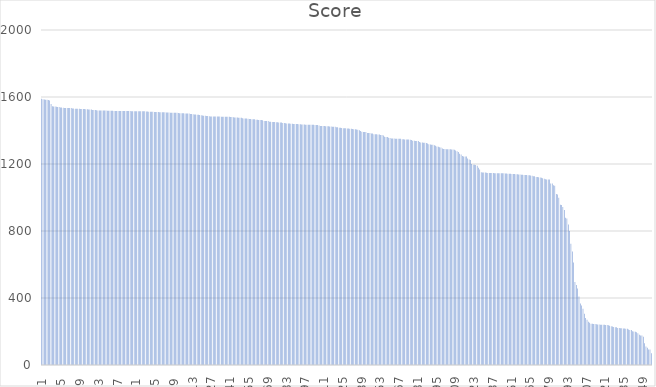
| Category | Series1 |
|---|---|
| 0 | 1589.4 |
| 1 | 1586 |
| 2 | 1585.5 |
| 3 | 1584.2 |
| 4 | 1584.2 |
| 5 | 1581.9 |
| 6 | 1579.1 |
| 7 | 1558.5 |
| 8 | 1544.2 |
| 9 | 1543.4 |
| 10 | 1542.6 |
| 11 | 1541.1 |
| 12 | 1540.6 |
| 13 | 1540.6 |
| 14 | 1537.3 |
| 15 | 1536.7 |
| 16 | 1535.6 |
| 17 | 1534.1 |
| 18 | 1534 |
| 19 | 1534 |
| 20 | 1534 |
| 21 | 1534 |
| 22 | 1533.8 |
| 23 | 1531.6 |
| 24 | 1531.3 |
| 25 | 1530.3 |
| 26 | 1530.3 |
| 27 | 1530.1 |
| 28 | 1529.8 |
| 29 | 1529 |
| 30 | 1529 |
| 31 | 1528.4 |
| 32 | 1527.9 |
| 33 | 1526.9 |
| 34 | 1526.2 |
| 35 | 1526 |
| 36 | 1525.9 |
| 37 | 1524.8 |
| 38 | 1522.8 |
| 39 | 1522.8 |
| 40 | 1522.8 |
| 41 | 1521.3 |
| 42 | 1518.9 |
| 43 | 1518.9 |
| 44 | 1518.9 |
| 45 | 1518.9 |
| 46 | 1518.9 |
| 47 | 1518.9 |
| 48 | 1518.9 |
| 49 | 1517.4 |
| 50 | 1517.4 |
| 51 | 1517.4 |
| 52 | 1517.4 |
| 53 | 1517.3 |
| 54 | 1517.1 |
| 55 | 1517 |
| 56 | 1517 |
| 57 | 1516.9 |
| 58 | 1516.9 |
| 59 | 1516.9 |
| 60 | 1516.9 |
| 61 | 1516.9 |
| 62 | 1516.1 |
| 63 | 1516.1 |
| 64 | 1516.1 |
| 65 | 1516.1 |
| 66 | 1516.1 |
| 67 | 1515.3 |
| 68 | 1515.3 |
| 69 | 1515.3 |
| 70 | 1515.2 |
| 71 | 1515 |
| 72 | 1514.8 |
| 73 | 1514.8 |
| 74 | 1514.7 |
| 75 | 1514.7 |
| 76 | 1514.7 |
| 77 | 1514.3 |
| 78 | 1513.1 |
| 79 | 1513 |
| 80 | 1512.6 |
| 81 | 1512.1 |
| 82 | 1511.7 |
| 83 | 1511.2 |
| 84 | 1511 |
| 85 | 1511 |
| 86 | 1510.8 |
| 87 | 1510.2 |
| 88 | 1509.2 |
| 89 | 1509.2 |
| 90 | 1509.2 |
| 91 | 1508.9 |
| 92 | 1508.3 |
| 93 | 1508.1 |
| 94 | 1508 |
| 95 | 1507.4 |
| 96 | 1506.7 |
| 97 | 1506.7 |
| 98 | 1505.6 |
| 99 | 1505.3 |
| 100 | 1505.3 |
| 101 | 1505.3 |
| 102 | 1505.2 |
| 103 | 1503.3 |
| 104 | 1503.3 |
| 105 | 1503.3 |
| 106 | 1503.3 |
| 107 | 1502.2 |
| 108 | 1502.2 |
| 109 | 1501.5 |
| 110 | 1501.2 |
| 111 | 1498.3 |
| 112 | 1497.9 |
| 113 | 1496.8 |
| 114 | 1495.3 |
| 115 | 1494.8 |
| 116 | 1493.8 |
| 117 | 1493.7 |
| 118 | 1491.8 |
| 119 | 1491.2 |
| 120 | 1489.8 |
| 121 | 1487.7 |
| 122 | 1487.5 |
| 123 | 1487.2 |
| 124 | 1486.6 |
| 125 | 1485.4 |
| 126 | 1484.2 |
| 127 | 1484.2 |
| 128 | 1484.2 |
| 129 | 1484.2 |
| 130 | 1483.9 |
| 131 | 1483.9 |
| 132 | 1483.5 |
| 133 | 1483.5 |
| 134 | 1482.8 |
| 135 | 1482.4 |
| 136 | 1482.4 |
| 137 | 1482.3 |
| 138 | 1482 |
| 139 | 1482 |
| 140 | 1481.7 |
| 141 | 1480.5 |
| 142 | 1480.5 |
| 143 | 1479.3 |
| 144 | 1478.3 |
| 145 | 1478.3 |
| 146 | 1477.7 |
| 147 | 1476.1 |
| 148 | 1476.1 |
| 149 | 1475.5 |
| 150 | 1473 |
| 151 | 1471.5 |
| 152 | 1471.3 |
| 153 | 1471.1 |
| 154 | 1469.6 |
| 155 | 1469.2 |
| 156 | 1468.4 |
| 157 | 1467.4 |
| 158 | 1467 |
| 159 | 1467 |
| 160 | 1463.5 |
| 161 | 1463.5 |
| 162 | 1463.1 |
| 163 | 1462.7 |
| 164 | 1462.5 |
| 165 | 1461.9 |
| 166 | 1456.8 |
| 167 | 1456 |
| 168 | 1456 |
| 169 | 1456 |
| 170 | 1452.4 |
| 171 | 1452.2 |
| 172 | 1451.3 |
| 173 | 1451.3 |
| 174 | 1450.4 |
| 175 | 1449.8 |
| 176 | 1448.9 |
| 177 | 1448.4 |
| 178 | 1447.5 |
| 179 | 1447.2 |
| 180 | 1444.9 |
| 181 | 1444.8 |
| 182 | 1442.6 |
| 183 | 1442.2 |
| 184 | 1441.9 |
| 185 | 1441.2 |
| 186 | 1440 |
| 187 | 1439.6 |
| 188 | 1439.5 |
| 189 | 1439.1 |
| 190 | 1438.9 |
| 191 | 1438.1 |
| 192 | 1437.6 |
| 193 | 1437.4 |
| 194 | 1435.8 |
| 195 | 1435.8 |
| 196 | 1435.1 |
| 197 | 1434.8 |
| 198 | 1434.7 |
| 199 | 1434.6 |
| 200 | 1434.4 |
| 201 | 1434.3 |
| 202 | 1433.9 |
| 203 | 1433.9 |
| 204 | 1433.5 |
| 205 | 1433.5 |
| 206 | 1432.8 |
| 207 | 1430.2 |
| 208 | 1426.9 |
| 209 | 1426.7 |
| 210 | 1426.7 |
| 211 | 1426.7 |
| 212 | 1426.1 |
| 213 | 1426.1 |
| 214 | 1425.8 |
| 215 | 1424.1 |
| 216 | 1424 |
| 217 | 1422.3 |
| 218 | 1422.1 |
| 219 | 1421.7 |
| 220 | 1419.6 |
| 221 | 1419.6 |
| 222 | 1416.4 |
| 223 | 1415.7 |
| 224 | 1415.5 |
| 225 | 1413.3 |
| 226 | 1412.8 |
| 227 | 1412.8 |
| 228 | 1412.6 |
| 229 | 1411.8 |
| 230 | 1411.1 |
| 231 | 1410.1 |
| 232 | 1408.9 |
| 233 | 1407.5 |
| 234 | 1407.4 |
| 235 | 1406.7 |
| 236 | 1404.1 |
| 237 | 1402.2 |
| 238 | 1396.5 |
| 239 | 1392.7 |
| 240 | 1391.5 |
| 241 | 1391 |
| 242 | 1390.5 |
| 243 | 1385.4 |
| 244 | 1385.1 |
| 245 | 1384.4 |
| 246 | 1382.6 |
| 247 | 1382.2 |
| 248 | 1378 |
| 249 | 1377 |
| 250 | 1377 |
| 251 | 1376.3 |
| 252 | 1375.4 |
| 253 | 1372.8 |
| 254 | 1372.8 |
| 255 | 1370.8 |
| 256 | 1362.7 |
| 257 | 1361.2 |
| 258 | 1361.2 |
| 259 | 1356.9 |
| 260 | 1354.7 |
| 261 | 1352.6 |
| 262 | 1352.3 |
| 263 | 1352.1 |
| 264 | 1351.1 |
| 265 | 1350.2 |
| 266 | 1350.1 |
| 267 | 1350.1 |
| 268 | 1350.1 |
| 269 | 1348.1 |
| 270 | 1347.3 |
| 271 | 1346.8 |
| 272 | 1345.9 |
| 273 | 1345.9 |
| 274 | 1345.9 |
| 275 | 1345.5 |
| 276 | 1343.7 |
| 277 | 1339.3 |
| 278 | 1339.3 |
| 279 | 1337.6 |
| 280 | 1337.6 |
| 281 | 1337 |
| 282 | 1330.8 |
| 283 | 1328.6 |
| 284 | 1327.8 |
| 285 | 1327.5 |
| 286 | 1326.6 |
| 287 | 1325 |
| 288 | 1321.8 |
| 289 | 1318.6 |
| 290 | 1316.8 |
| 291 | 1314.8 |
| 292 | 1314.3 |
| 293 | 1311.5 |
| 294 | 1308.8 |
| 295 | 1304 |
| 296 | 1303.3 |
| 297 | 1299.8 |
| 298 | 1299.2 |
| 299 | 1293.2 |
| 300 | 1289.9 |
| 301 | 1289.9 |
| 302 | 1287.5 |
| 303 | 1287.5 |
| 304 | 1287.5 |
| 305 | 1287.5 |
| 306 | 1287.3 |
| 307 | 1287.3 |
| 308 | 1285.1 |
| 309 | 1280.7 |
| 310 | 1276 |
| 311 | 1272 |
| 312 | 1261.2 |
| 313 | 1257.1 |
| 314 | 1248.3 |
| 315 | 1244.1 |
| 316 | 1244.1 |
| 317 | 1244.1 |
| 318 | 1232.4 |
| 319 | 1227.5 |
| 320 | 1224.3 |
| 321 | 1200.7 |
| 322 | 1196.2 |
| 323 | 1195.1 |
| 324 | 1193.3 |
| 325 | 1189 |
| 326 | 1177 |
| 327 | 1167 |
| 328 | 1151.4 |
| 329 | 1149.5 |
| 330 | 1149 |
| 331 | 1149 |
| 332 | 1148.4 |
| 333 | 1146.9 |
| 334 | 1146.9 |
| 335 | 1146.2 |
| 336 | 1146.2 |
| 337 | 1145.8 |
| 338 | 1145.5 |
| 339 | 1145.4 |
| 340 | 1145.3 |
| 341 | 1145.3 |
| 342 | 1145.3 |
| 343 | 1145 |
| 344 | 1144.7 |
| 345 | 1144.2 |
| 346 | 1143.8 |
| 347 | 1143.2 |
| 348 | 1142.3 |
| 349 | 1142.2 |
| 350 | 1141.6 |
| 351 | 1140.7 |
| 352 | 1140.7 |
| 353 | 1140.3 |
| 354 | 1139.5 |
| 355 | 1139 |
| 356 | 1137.4 |
| 357 | 1137.4 |
| 358 | 1136.3 |
| 359 | 1136 |
| 360 | 1134.9 |
| 361 | 1134.9 |
| 362 | 1134.4 |
| 363 | 1133.2 |
| 364 | 1133 |
| 365 | 1130.7 |
| 366 | 1130 |
| 367 | 1127.4 |
| 368 | 1127.3 |
| 369 | 1122.6 |
| 370 | 1122.6 |
| 371 | 1120.3 |
| 372 | 1119 |
| 373 | 1118.1 |
| 374 | 1115.3 |
| 375 | 1111.2 |
| 376 | 1108.9 |
| 377 | 1107.9 |
| 378 | 1107.5 |
| 379 | 1107.5 |
| 380 | 1083.5 |
| 381 | 1082.9 |
| 382 | 1073.5 |
| 383 | 1070.1 |
| 384 | 1020.3 |
| 385 | 1017.6 |
| 386 | 999.1 |
| 387 | 957.1 |
| 388 | 955.5 |
| 389 | 943.3 |
| 390 | 926 |
| 391 | 879.3 |
| 392 | 874.9 |
| 393 | 838.5 |
| 394 | 800.6 |
| 395 | 724.3 |
| 396 | 677.2 |
| 397 | 611.7 |
| 398 | 495 |
| 399 | 477.7 |
| 400 | 457.3 |
| 401 | 409.4 |
| 402 | 367.4 |
| 403 | 355.4 |
| 404 | 336.1 |
| 405 | 305.6 |
| 406 | 280.1 |
| 407 | 270.3 |
| 408 | 257.9 |
| 409 | 251.5 |
| 410 | 245.8 |
| 411 | 245.6 |
| 412 | 245 |
| 413 | 244.3 |
| 414 | 243.1 |
| 415 | 242.3 |
| 416 | 242.1 |
| 417 | 240.8 |
| 418 | 240.6 |
| 419 | 240.3 |
| 420 | 240.2 |
| 421 | 239.5 |
| 422 | 239.4 |
| 423 | 237.1 |
| 424 | 234.7 |
| 425 | 231.5 |
| 426 | 229.3 |
| 427 | 226.8 |
| 428 | 225.7 |
| 429 | 225.5 |
| 430 | 220.9 |
| 431 | 220.5 |
| 432 | 219.8 |
| 433 | 219.4 |
| 434 | 217.6 |
| 435 | 217.6 |
| 436 | 217.1 |
| 437 | 215.9 |
| 438 | 212 |
| 439 | 209.1 |
| 440 | 209 |
| 441 | 201.5 |
| 442 | 199.8 |
| 443 | 199.1 |
| 444 | 196.1 |
| 445 | 190 |
| 446 | 180.1 |
| 447 | 176 |
| 448 | 176 |
| 449 | 168.6 |
| 450 | 129.6 |
| 451 | 111.1 |
| 452 | 103.4 |
| 453 | 92.2 |
| 454 | 92.2 |
| 455 | 70.3 |